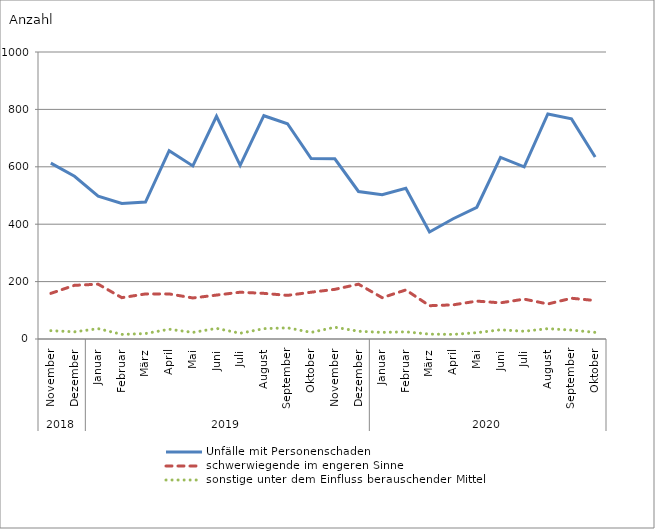
| Category | Unfälle mit Personenschaden | schwerwiegende im engeren Sinne | sonstige unter dem Einfluss berauschender Mittel |
|---|---|---|---|
| 0 | 613 | 159 | 29 |
| 1 | 567 | 187 | 25 |
| 2 | 498 | 191 | 36 |
| 3 | 472 | 144 | 16 |
| 4 | 477 | 157 | 19 |
| 5 | 656 | 157 | 34 |
| 6 | 603 | 143 | 23 |
| 7 | 776 | 153 | 37 |
| 8 | 605 | 163 | 20 |
| 9 | 778 | 159 | 36 |
| 10 | 750 | 152 | 39 |
| 11 | 629 | 163 | 23 |
| 12 | 628 | 173 | 41 |
| 13 | 514 | 191 | 27 |
| 14 | 503 | 144 | 23 |
| 15 | 525 | 171 | 25 |
| 16 | 373 | 116 | 17 |
| 17 | 419 | 119 | 16 |
| 18 | 459 | 132 | 22 |
| 19 | 633 | 126 | 32 |
| 20 | 600 | 139 | 27 |
| 21 | 784 | 122 | 36 |
| 22 | 767 | 142 | 31 |
| 23 | 634 | 134 | 23 |